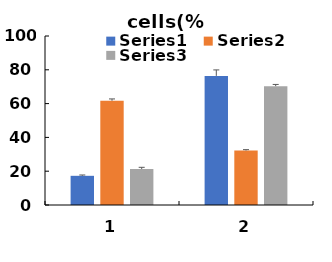
| Category | Series 0 | Series 1 | Series 2 |
|---|---|---|---|
| 0 | 17.267 | 61.697 | 21.3 |
| 1 | 76.4 | 32.267 | 70.333 |